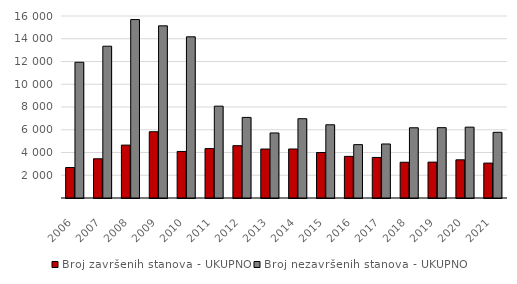
| Category | Broj završenih stanova - UKUPNO  | Broj nezavršenih stanova - UKUPNO  |
|---|---|---|
| 2006.0 | 2679 | 11932 |
| 2007.0 | 3448 | 13344 |
| 2008.0 | 4650 | 15688 |
| 2009.0 | 5825 | 15135 |
| 2010.0 | 4093 | 14169 |
| 2011.0 | 4343 | 8075 |
| 2012.0 | 4599 | 7084 |
| 2013.0 | 4305 | 5718 |
| 2014.0 | 4309 | 6971 |
| 2015.0 | 3999 | 6438 |
| 2016.0 | 3658 | 4692 |
| 2017.0 | 3565 | 4749 |
| 2018.0 | 3142 | 6174 |
| 2019.0 | 3154 | 6183 |
| 2020.0 | 3356 | 6229 |
| 2021.0 | 3070 | 5776 |